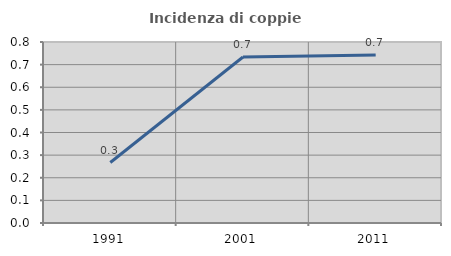
| Category | Incidenza di coppie miste |
|---|---|
| 1991.0 | 0.267 |
| 2001.0 | 0.733 |
| 2011.0 | 0.743 |